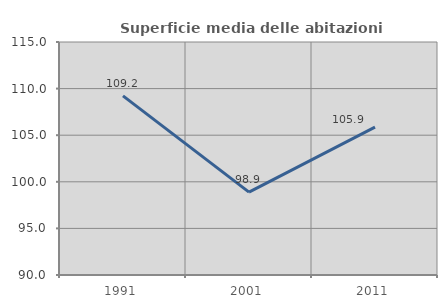
| Category | Superficie media delle abitazioni occupate |
|---|---|
| 1991.0 | 109.221 |
| 2001.0 | 98.897 |
| 2011.0 | 105.864 |